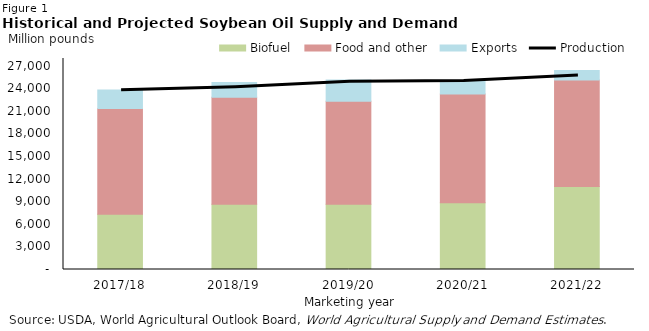
| Category | Biofuel | Food and other | Exports |
|---|---|---|---|
| 2017/18 | 7333.71 | 14046.501 | 2443.038 |
| 2018/19 | 8663.3 | 14210.857 | 1940.422 |
| 2019/20 | 8657.82 | 13659.142 | 2836.691 |
| 2020/21 | 8850 | 14426.982 | 1723.499 |
| 2021/22 | 11000 | 14150 | 1250 |